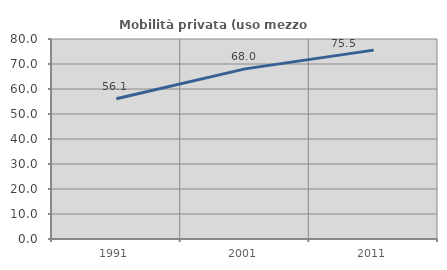
| Category | Mobilità privata (uso mezzo privato) |
|---|---|
| 1991.0 | 56.085 |
| 2001.0 | 68.047 |
| 2011.0 | 75.547 |